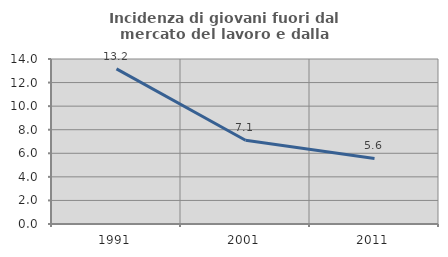
| Category | Incidenza di giovani fuori dal mercato del lavoro e dalla formazione  |
|---|---|
| 1991.0 | 13.166 |
| 2001.0 | 7.108 |
| 2011.0 | 5.563 |